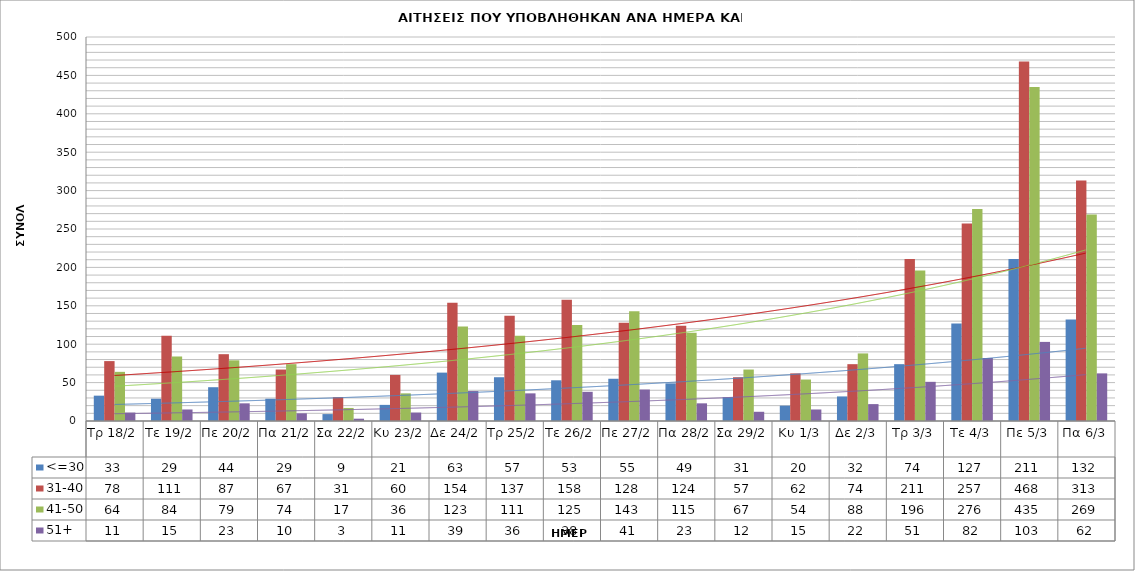
| Category | <=30 | 31-40 | 41-50 | 51+ |
|---|---|---|---|---|
| Τρ 18/2 | 33 | 78 | 64 | 11 |
| Τε 19/2 | 29 | 111 | 84 | 15 |
| Πε 20/2 | 44 | 87 | 79 | 23 |
| Πα 21/2 | 29 | 67 | 74 | 10 |
| Σα 22/2 | 9 | 31 | 17 | 3 |
| Κυ 23/2 | 21 | 60 | 36 | 11 |
| Δε 24/2 | 63 | 154 | 123 | 39 |
| Τρ 25/2 | 57 | 137 | 111 | 36 |
| Τε 26/2 | 53 | 158 | 125 | 38 |
| Πε 27/2 | 55 | 128 | 143 | 41 |
| Πα 28/2 | 49 | 124 | 115 | 23 |
| Σα 29/2 | 31 | 57 | 67 | 12 |
| Κυ 1/3 | 20 | 62 | 54 | 15 |
| Δε 2/3 | 32 | 74 | 88 | 22 |
| Τρ 3/3 | 74 | 211 | 196 | 51 |
| Τε 4/3 | 127 | 257 | 276 | 82 |
| Πε 5/3 | 211 | 468 | 435 | 103 |
| Πα 6/3 | 132 | 313 | 269 | 62 |